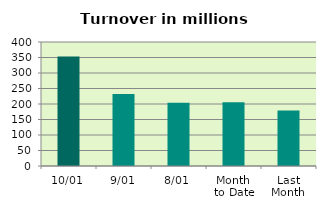
| Category | Series 0 |
|---|---|
| 10/01 | 353.554 |
| 9/01 | 232.387 |
| 8/01 | 204.323 |
| Month 
to Date | 205.641 |
| Last
Month | 179.047 |